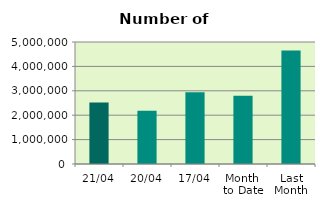
| Category | Series 0 |
|---|---|
| 21/04 | 2517112 |
| 20/04 | 2183562 |
| 17/04 | 2943426 |
| Month 
to Date | 2798655.692 |
| Last
Month | 4654844.727 |